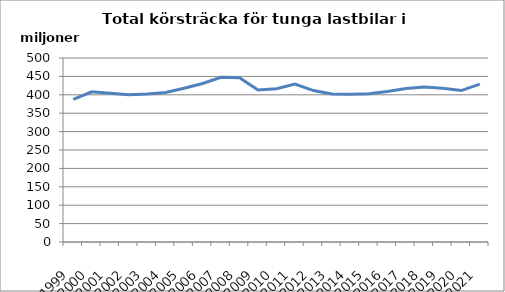
| Category | Series 0 |
|---|---|
| 1999.0 | 387529952.7 |
| 2000.0 | 407949959.1 |
| 2001.0 | 404401727.1 |
| 2002.0 | 400458597.8 |
| 2003.0 | 402120426.3 |
| 2004.0 | 406208411.1 |
| 2005.0 | 417862383 |
| 2006.0 | 430717904.2 |
| 2007.0 | 447498910 |
| 2008.0 | 446391725.2 |
| 2009.0 | 412813674.1 |
| 2010.0 | 416291188.9 |
| 2011.0 | 429105680 |
| 2012.0 | 411414014 |
| 2013.0 | 402097443 |
| 2014.0 | 401650327.7 |
| 2015.0 | 403178550.6 |
| 2016.0 | 408689185.1 |
| 2017.0 | 417208858 |
| 2018.0 | 421093690 |
| 2019.0 | 417605755 |
| 2020.0 | 411537668.7 |
| 2021.0 | 429040332.5 |